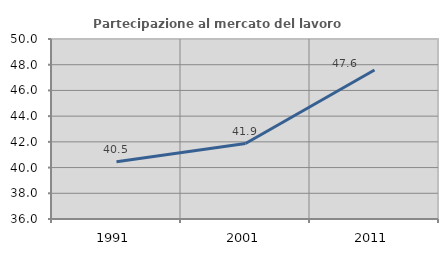
| Category | Partecipazione al mercato del lavoro  femminile |
|---|---|
| 1991.0 | 40.458 |
| 2001.0 | 41.871 |
| 2011.0 | 47.586 |